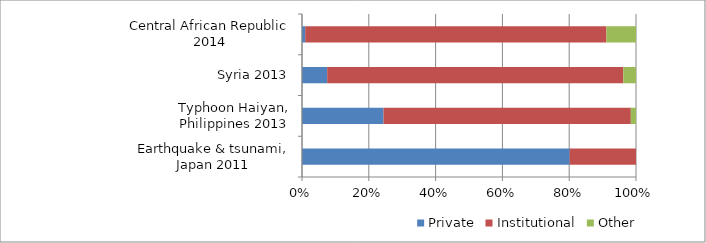
| Category | Private | Institutional | Other |
|---|---|---|---|
| Earthquake & tsunami, Japan 2011 | 0.579 | 0.144 | 0 |
| Typhoon Haiyan, Philippines 2013 | 0.164 | 0.497 | 0.01 |
| Syria 2013 | 0.339 | 3.981 | 0.171 |
| Central African Republic 2014 | 0.001 | 0.081 | 0.008 |